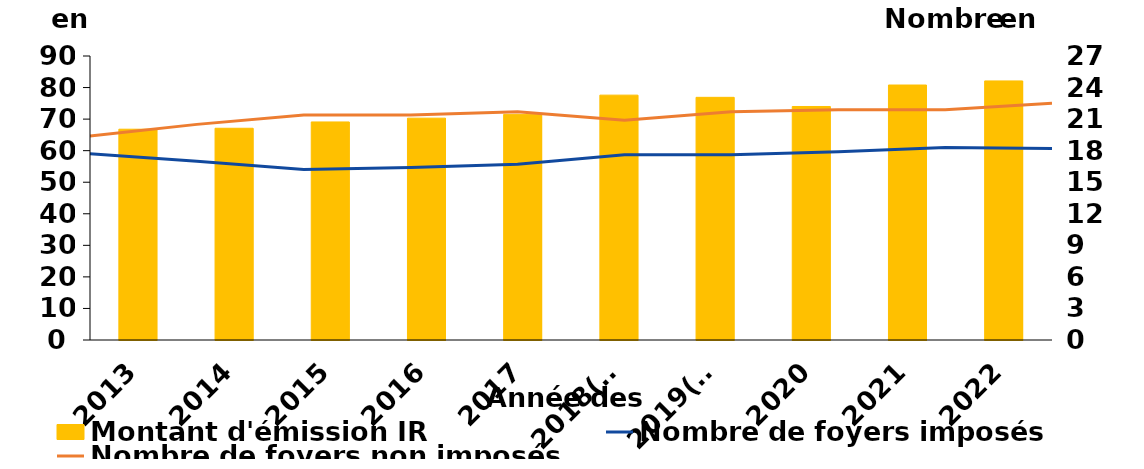
| Category | Montant d'émission IR |
|---|---|
| 2013 | 66.8 |
| 2014 | 67.1 |
| 2015 | 69.1 |
| 2016 | 70.3 |
| 2017 | 71.5 |
| 2018(*) | 77.6 |
| 2019(*) | 76.9 |
| 2020 | 74 |
| 2021 | 80.8 |
| 2022 | 82.1 |